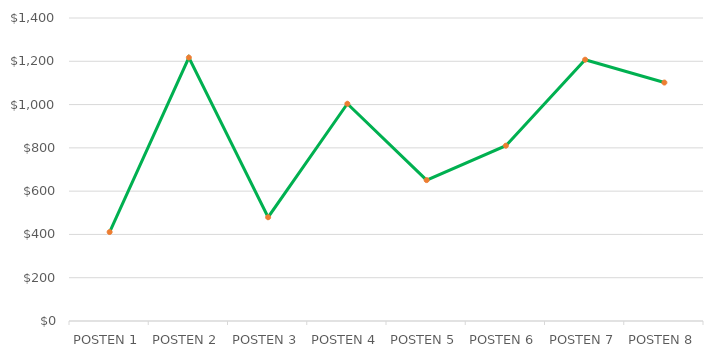
| Category | Series 1 |
|---|---|
| POSTEN 1 | 411.07 |
| POSTEN 2 | 1217.065 |
| POSTEN 3 | 479.5 |
| POSTEN 4 | 1003.75 |
| POSTEN 5 | 651 |
| POSTEN 6 | 810 |
| POSTEN 7 | 1207.25 |
| POSTEN 8 | 1101.76 |